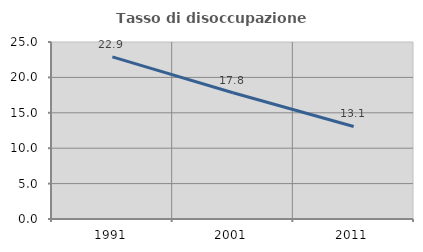
| Category | Tasso di disoccupazione giovanile  |
|---|---|
| 1991.0 | 22.899 |
| 2001.0 | 17.832 |
| 2011.0 | 13.068 |